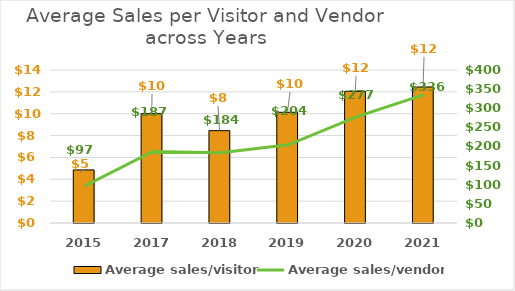
| Category | Average sales/visitor |
|---|---|
| 2015.0 | 4.859 |
| 2017.0 | 10 |
| 2018.0 | 8.45 |
| 2019.0 | 10.129 |
| 2020.0 | 12.051 |
| 2021.0 | 12.443 |